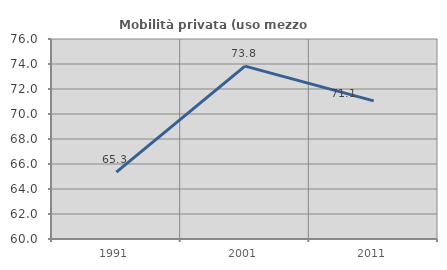
| Category | Mobilità privata (uso mezzo privato) |
|---|---|
| 1991.0 | 65.35 |
| 2001.0 | 73.829 |
| 2011.0 | 71.054 |